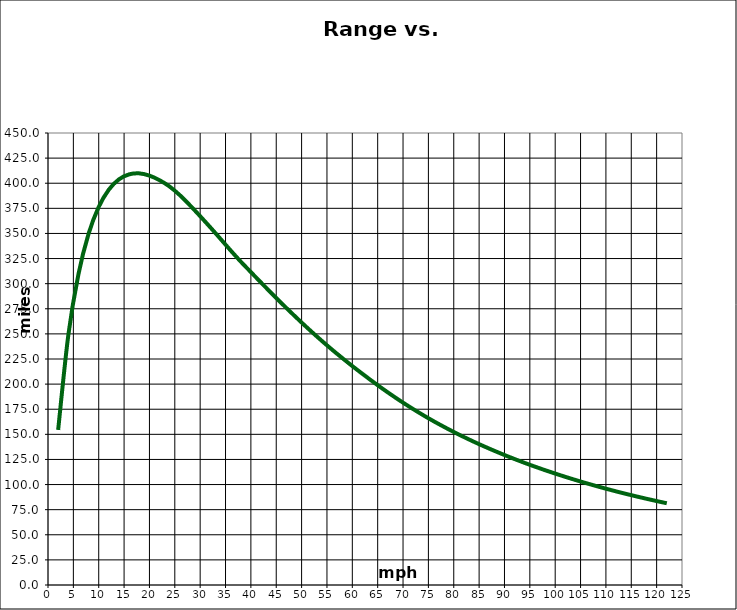
| Category | Series 1 |
|---|---|
| 2.0 | 154.377 |
| 4.0 | 248.633 |
| 6.0 | 309.319 |
| 8.0 | 349.673 |
| 10.0 | 376.429 |
| 12.0 | 393.644 |
| 14.0 | 403.907 |
| 16.0 | 408.831 |
| 18.0 | 409.806 |
| 20.0 | 407.558 |
| 22.0 | 402.989 |
| 24.0 | 396.596 |
| 26.0 | 388.062 |
| 28.0 | 377.955 |
| 30.0 | 367.181 |
| 32.0 | 356.079 |
| 34.0 | 344.655 |
| 36.0 | 333.111 |
| 38.0 | 321.976 |
| 40.0 | 311.509 |
| 42.0 | 301.073 |
| 44.0 | 290.79 |
| 46.0 | 280.712 |
| 48.0 | 270.896 |
| 50.0 | 261.307 |
| 52.0 | 251.993 |
| 54.0 | 242.997 |
| 56.0 | 234.342 |
| 58.0 | 226.021 |
| 60.0 | 217.969 |
| 62.0 | 210.221 |
| 64.0 | 202.623 |
| 66.0 | 195.292 |
| 68.0 | 188.272 |
| 70.0 | 181.548 |
| 72.0 | 175.12 |
| 74.0 | 168.997 |
| 76.0 | 163.151 |
| 78.0 | 157.647 |
| 80.0 | 152.35 |
| 82.0 | 147.323 |
| 84.0 | 142.528 |
| 86.0 | 137.962 |
| 88.0 | 133.599 |
| 90.0 | 129.403 |
| 92.0 | 125.365 |
| 94.0 | 121.517 |
| 96.0 | 117.846 |
| 98.0 | 114.307 |
| 100.0 | 110.925 |
| 102.0 | 107.668 |
| 104.0 | 104.541 |
| 106.0 | 101.536 |
| 108.0 | 98.651 |
| 110.0 | 95.879 |
| 112.0 | 93.216 |
| 114.0 | 90.674 |
| 116.0 | 88.215 |
| 118.0 | 85.848 |
| 120.0 | 83.573 |
| 122.0 | 81.389 |